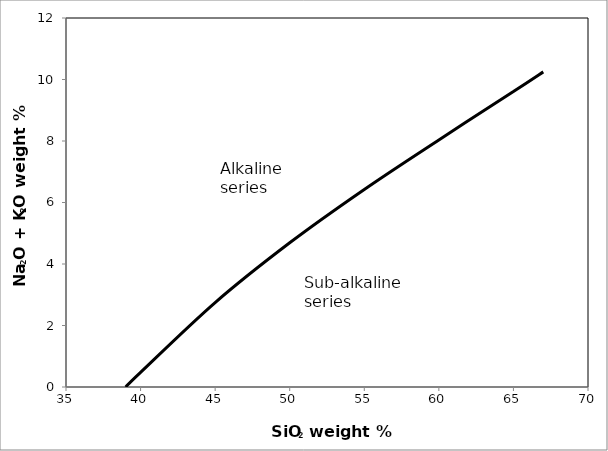
| Category | Series 0 |
|---|---|
| 39.0 | 0 |
| 40.0 | 0.478 |
| 45.0 | 2.748 |
| 50.0 | 4.691 |
| 55.0 | 6.425 |
| 60.0 | 8.036 |
| 65.0 | 9.61 |
| 67.0 | 10.248 |